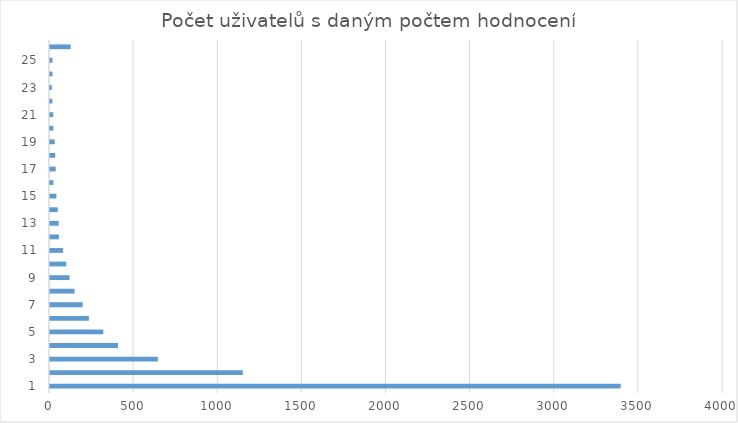
| Category | Users |
|---|---|
| 1 | 3392 |
| 2 | 1146 |
| 3 | 641 |
| 4 | 404 |
| 5 | 317 |
| 6 | 231 |
| 7 | 194 |
| 8 | 146 |
| 9 | 116 |
| 10 | 97 |
| 11 | 78 |
| 12 | 53 |
| 13 | 52 |
| 14 | 46 |
| 15 | 38 |
| 16 | 20 |
| 17 | 34 |
| 18 | 31 |
| 19 | 28 |
| 20 | 20 |
| 21 | 19 |
| 22 | 14 |
| 23 | 11 |
| 24 | 15 |
| 25 | 15 |
| >25 | 123 |